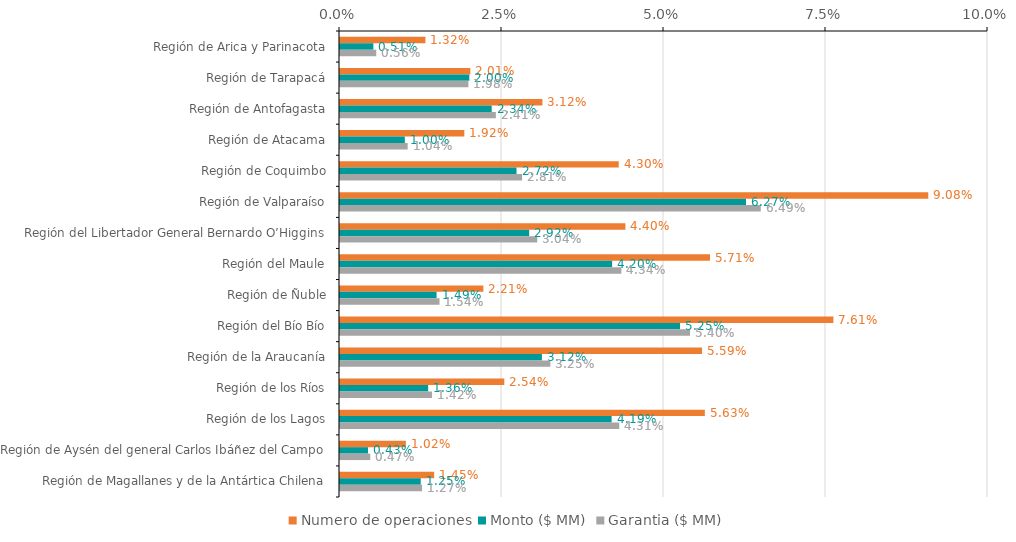
| Category | Numero de operaciones | Monto ($ MM) | Garantia ($ MM) |
|---|---|---|---|
| Región de Arica y Parinacota | 0.013 | 0.005 | 0.006 |
| Región de Tarapacá | 0.02 | 0.02 | 0.02 |
| Región de Antofagasta | 0.031 | 0.023 | 0.024 |
| Región de Atacama | 0.019 | 0.01 | 0.01 |
| Región de Coquimbo | 0.043 | 0.027 | 0.028 |
| Región de Valparaíso | 0.091 | 0.063 | 0.065 |
| Región del Libertador General Bernardo O’Higgins | 0.044 | 0.029 | 0.03 |
| Región del Maule | 0.057 | 0.042 | 0.043 |
| Región de Ñuble | 0.022 | 0.015 | 0.015 |
| Región del Bío Bío | 0.076 | 0.052 | 0.054 |
| Región de la Araucanía | 0.056 | 0.031 | 0.032 |
| Región de los Ríos | 0.025 | 0.014 | 0.014 |
| Región de los Lagos | 0.056 | 0.042 | 0.043 |
| Región de Aysén del general Carlos Ibáñez del Campo | 0.01 | 0.004 | 0.005 |
| Región de Magallanes y de la Antártica Chilena | 0.015 | 0.012 | 0.013 |